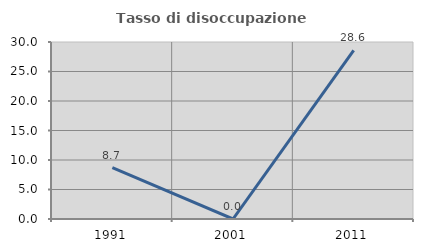
| Category | Tasso di disoccupazione giovanile  |
|---|---|
| 1991.0 | 8.696 |
| 2001.0 | 0 |
| 2011.0 | 28.571 |